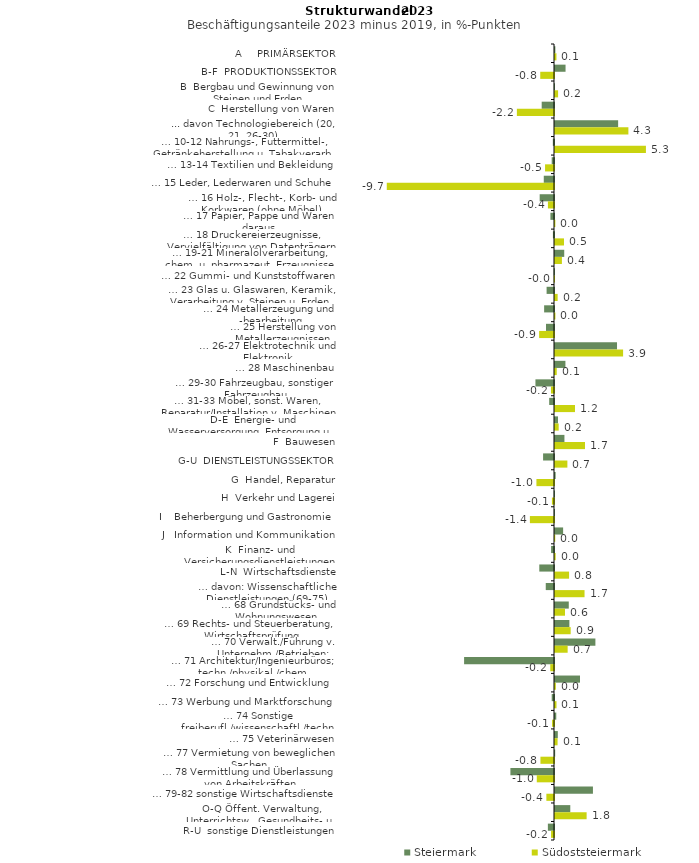
| Category | Steiermark | Südoststeiermark |
|---|---|---|
| A     PRIMÄRSEKTOR | 0.022 | 0.084 |
| B-F  PRODUKTIONSSEKTOR | 0.612 | -0.797 |
| B  Bergbau und Gewinnung von Steinen und Erden | -0.009 | 0.179 |
| C  Herstellung von Waren | -0.714 | -2.152 |
| ... davon Technologiebereich (20, 21, 26-30) | 3.66 | 4.254 |
| … 10-12 Nahrungs-, Futtermittel-, Getränkeherstellung u. Tabakverarb. | -0.068 | 5.271 |
| … 13-14 Textilien und Bekleidung | -0.134 | -0.519 |
| … 15 Leder, Lederwaren und Schuhe | -0.593 | -9.694 |
| … 16 Holz-, Flecht-, Korb- und Korkwaren (ohne Möbel)  | -0.83 | -0.352 |
| … 17 Papier, Pappe und Waren daraus  | -0.208 | 0.02 |
| … 18 Druckereierzeugnisse, Vervielfältigung von Datenträgern | -0.063 | 0.52 |
| … 19-21 Mineralölverarbeitung, chem. u. pharmazeut. Erzeugnisse | 0.535 | 0.4 |
| … 22 Gummi- und Kunststoffwaren | -0.02 | -0.014 |
| … 23 Glas u. Glaswaren, Keramik, Verarbeitung v. Steinen u. Erden  | -0.429 | 0.154 |
| … 24 Metallerzeugung und -bearbeitung | -0.572 | 0.025 |
| … 25 Herstellung von Metallerzeugnissen  | -0.464 | -0.862 |
| … 26-27 Elektrotechnik und Elektronik | 3.595 | 3.948 |
| … 28 Maschinenbau | 0.604 | 0.101 |
| … 29-30 Fahrzeugbau, sonstiger Fahrzeugbau | -1.076 | -0.176 |
| … 31-33 Möbel, sonst. Waren, Reparatur/Installation v. Maschinen | -0.279 | 1.158 |
| D-E  Energie- und Wasserversorgung, Entsorgung u. Rückgewinnung | 0.175 | 0.213 |
| F  Bauwesen | 0.547 | 1.738 |
| G-U  DIENSTLEISTUNGSSEKTOR | -0.633 | 0.717 |
| G  Handel, Reparatur | 0.038 | -1.019 |
| H  Verkehr und Lagerei | -0.011 | -0.12 |
| I    Beherbergung und Gastronomie | -0.007 | -1.398 |
| J   Information und Kommunikation | 0.471 | 0.014 |
| K  Finanz- und Versicherungsdienstleistungen | -0.168 | 0.039 |
| L-N  Wirtschaftsdienste | -0.853 | 0.817 |
| … davon: Wissenschaftliche Dienstleistungen (69-75) | -0.478 | 1.712 |
| … 68 Grundstücks- und Wohnungswesen  | 0.798 | 0.579 |
| … 69 Rechts- und Steuerberatung, Wirtschaftsprüfung | 0.834 | 0.909 |
| … 70 Verwalt./Führung v. Unternehm./Betrieben; Unternehmensberat. | 2.342 | 0.733 |
| … 71 Architektur/Ingenieurbüros; techn./physikal./chem. Untersuchung | -5.212 | -0.216 |
| … 72 Forschung und Entwicklung  | 1.449 | 0.049 |
| … 73 Werbung und Marktforschung | -0.133 | 0.086 |
| … 74 Sonstige freiberufl./wissenschaftl./techn. Tätigkeiten | 0.074 | -0.112 |
| … 75 Veterinärwesen | 0.163 | 0.15 |
| … 77 Vermietung von beweglichen Sachen  | 0.011 | -0.786 |
| … 78 Vermittlung und Überlassung von Arbeitskräften | -2.527 | -0.998 |
| … 79-82 sonstige Wirtschaftsdienste | 2.199 | -0.443 |
| O-Q Öffent. Verwaltung, Unterrichtsw., Gesundheits- u. Sozialwesen | 0.886 | 1.834 |
| R-U  sonstige Dienstleistungen | -0.355 | -0.171 |